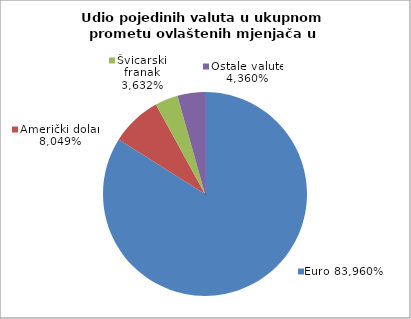
| Category | EUR |
|---|---|
| 0 | 0.84 |
| 1 | 0.08 |
| 2 | 0.036 |
| 3 | 0.044 |